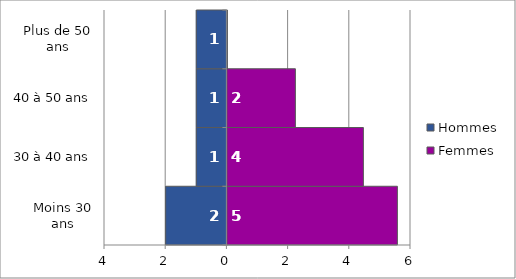
| Category | Hommes |
|---|---|
| Moins 30 ans | -2 |
| 30 à 40 ans | -1 |
| 40 à 50 ans | -1 |
| Plus de 50 ans | -1 |